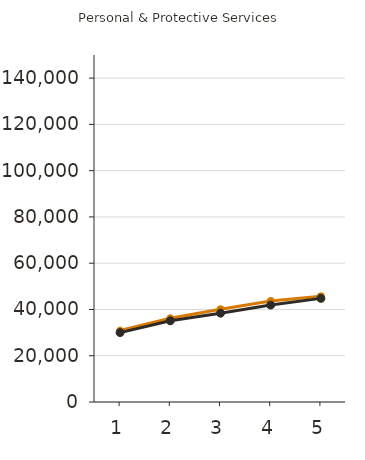
| Category | College-level Certificate | College-level Diploma | Bachelor's Degree | Master's Degree | Doctoral Degree | Professional Degree |
|---|---|---|---|---|---|---|
| 1.0 | 30900 | 30000 |  |  |  |  |
| 2.0 | 36200 | 35100 |  |  |  |  |
| 3.0 | 40100 | 38400 |  |  |  |  |
| 4.0 | 43700 | 41900 |  |  |  |  |
| 5.0 | 45700 | 44800 |  |  |  |  |